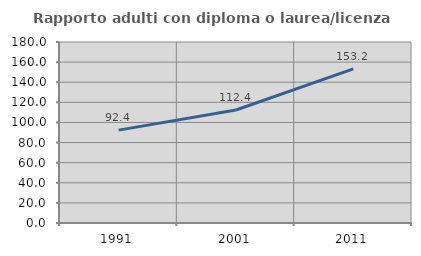
| Category | Rapporto adulti con diploma o laurea/licenza media  |
|---|---|
| 1991.0 | 92.373 |
| 2001.0 | 112.387 |
| 2011.0 | 153.191 |